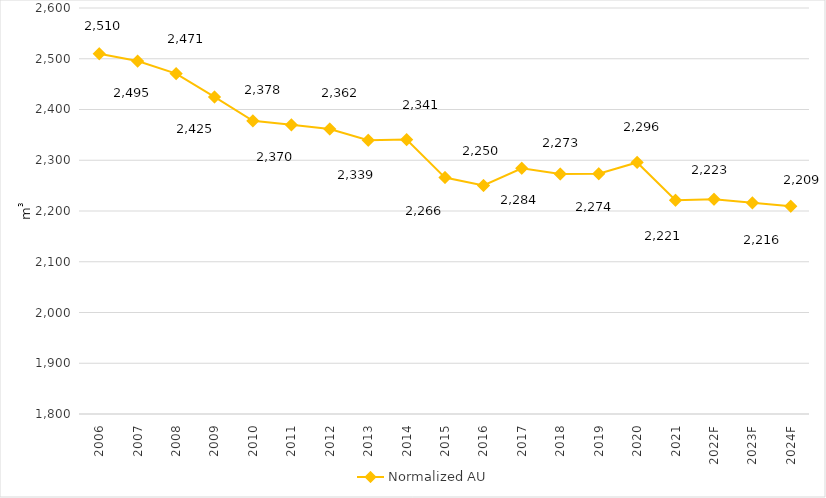
| Category | Normalized AU |
|---|---|
| 2006 | 2509.762 |
| 2007 | 2495.492 |
| 2008 | 2470.62 |
| 2009 | 2424.788 |
| 2010 | 2377.607 |
| 2011 | 2369.807 |
| 2012 | 2361.606 |
| 2013 | 2339.42 |
| 2014 | 2340.71 |
| 2015 | 2265.835 |
| 2016 | 2250.186 |
| 2017 | 2284.217 |
| 2018 | 2272.972 |
| 2019 | 2273.5 |
| 2020 | 2295.642 |
| 2021 | 2221.15 |
| 2022F | 2223.187 |
| 2023F | 2216.092 |
| 2024F | 2209.43 |